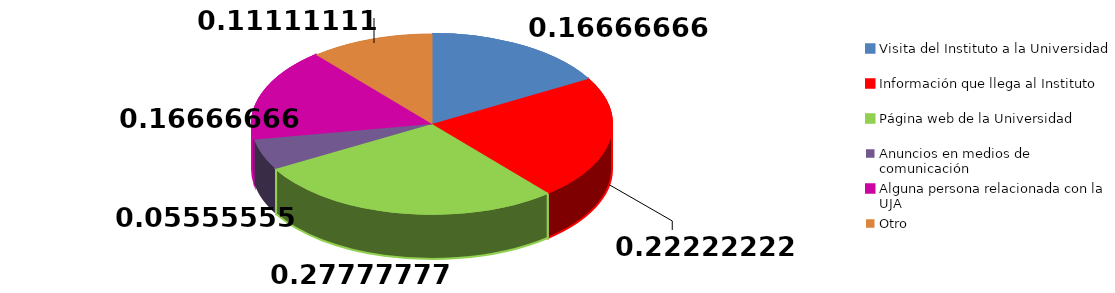
| Category | Frecuencia | Series 1 |
|---|---|---|
| Visita del Instituto a la Universidad | 3 |  |
| Información que llega al Instituto | 4 |  |
| Página web de la Universidad | 5 |  |
| Anuncios en medios de comunicación | 1 |  |
| Alguna persona relacionada con la UJA | 3 |  |
| Otro | 2 |  |